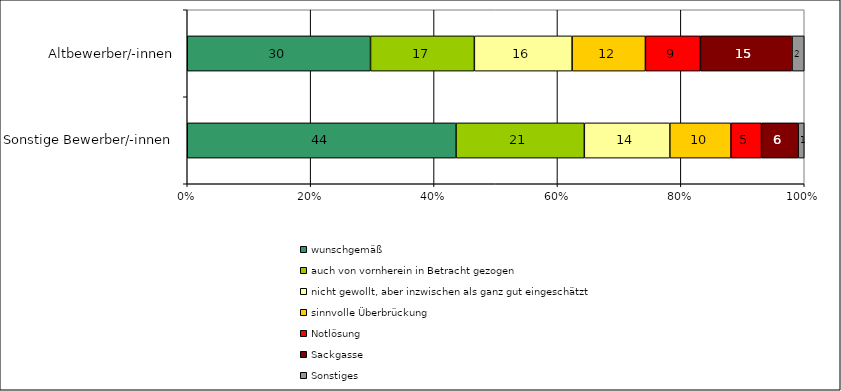
| Category | wunschgemäß | auch von vornherein in Betracht gezogen | nicht gewollt, aber inzwischen als ganz gut eingeschätzt | sinnvolle Überbrückung | Notlösung | Sackgasse | Sonstiges |
|---|---|---|---|---|---|---|---|
| Sonstige Bewerber/-innen | 44 | 21 | 14 | 10 | 5 | 6 | 1 |
| Altbewerber/-innen | 30 | 17 | 16 | 12 | 9 | 15 | 2 |